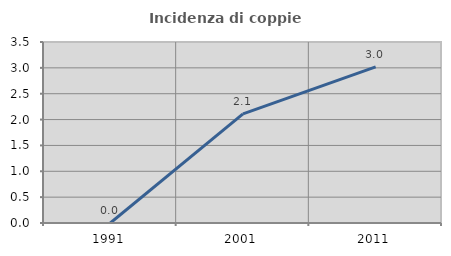
| Category | Incidenza di coppie miste |
|---|---|
| 1991.0 | 0 |
| 2001.0 | 2.11 |
| 2011.0 | 3.02 |